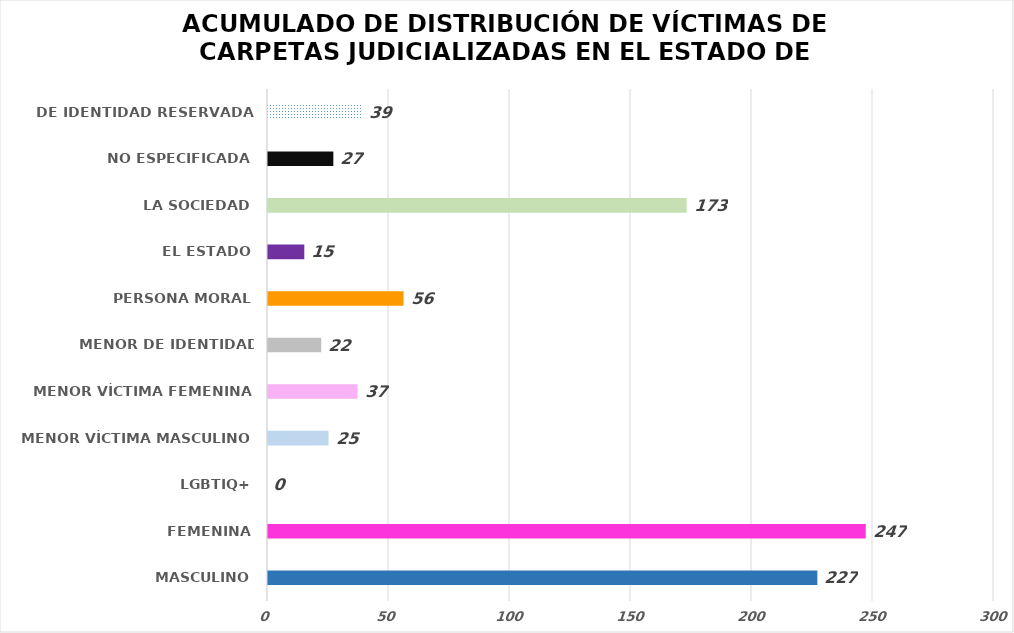
| Category | Series 0 |
|---|---|
| MASCULINO | 227 |
| FEMENINA | 247 |
| LGBTIQ+ | 0 |
| MENOR VÍCTIMA MASCULINO | 25 |
| MENOR VÍCTIMA FEMENINA | 37 |
| MENOR DE IDENTIDAD RESERVADA | 22 |
| PERSONA MORAL | 56 |
| EL ESTADO | 15 |
| LA SOCIEDAD | 173 |
| NO ESPECIFICADA | 27 |
| DE IDENTIDAD RESERVADA | 39 |